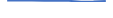
| Category | Series 0 |
|---|---|
| 0 | 7 |
| 1 | 7 |
| 2 | 7 |
| 3 | 6 |
| 4 | 8 |
| 5 | 6 |
| 6 | 1 |
| 7 | 2 |
| 8 | 5 |